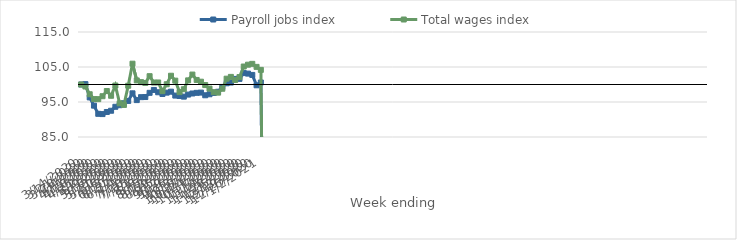
| Category | Payroll jobs index | Total wages index |
|---|---|---|
| 14/03/2020 | 100 | 100 |
| 21/03/2020 | 100.107 | 99.42 |
| 28/03/2020 | 96.311 | 97.217 |
| 04/04/2020 | 93.957 | 95.83 |
| 11/04/2020 | 91.617 | 95.816 |
| 18/04/2020 | 91.546 | 96.654 |
| 25/04/2020 | 92.147 | 98.137 |
| 02/05/2020 | 92.5 | 96.78 |
| 09/05/2020 | 93.63 | 99.706 |
| 16/05/2020 | 94.08 | 94.626 |
| 23/05/2020 | 94.641 | 94.158 |
| 30/05/2020 | 95.304 | 99.648 |
| 06/06/2020 | 97.474 | 105.944 |
| 13/06/2020 | 95.542 | 101.168 |
| 20/06/2020 | 96.381 | 100.675 |
| 27/06/2020 | 96.417 | 100.439 |
| 04/07/2020 | 97.617 | 102.378 |
| 11/07/2020 | 98.441 | 100.554 |
| 18/07/2020 | 97.784 | 100.577 |
| 25/07/2020 | 97.29 | 98.112 |
| 01/08/2020 | 97.676 | 100.071 |
| 08/08/2020 | 97.95 | 102.5 |
| 15/08/2020 | 96.832 | 101.101 |
| 22/08/2020 | 96.706 | 97.815 |
| 29/08/2020 | 96.534 | 98.644 |
| 05/09/2020 | 97.121 | 101.183 |
| 12/09/2020 | 97.432 | 102.836 |
| 19/09/2020 | 97.617 | 101.299 |
| 26/09/2020 | 97.69 | 100.799 |
| 03/10/2020 | 96.92 | 99.843 |
| 10/10/2020 | 97.213 | 98.835 |
| 17/10/2020 | 97.586 | 97.808 |
| 24/10/2020 | 97.931 | 97.674 |
| 31/10/2020 | 99.303 | 98.788 |
| 07/11/2020 | 100.35 | 101.665 |
| 14/11/2020 | 100.554 | 102.176 |
| 21/11/2020 | 101.598 | 101.29 |
| 28/11/2020 | 101.61 | 102.113 |
| 05/12/2020 | 103.266 | 105.136 |
| 12/12/2020 | 103.109 | 105.661 |
| 19/12/2020 | 102.735 | 105.901 |
| 26/12/2020 | 99.774 | 105.035 |
| 02/01/2021 | 100.575 | 104.178 |